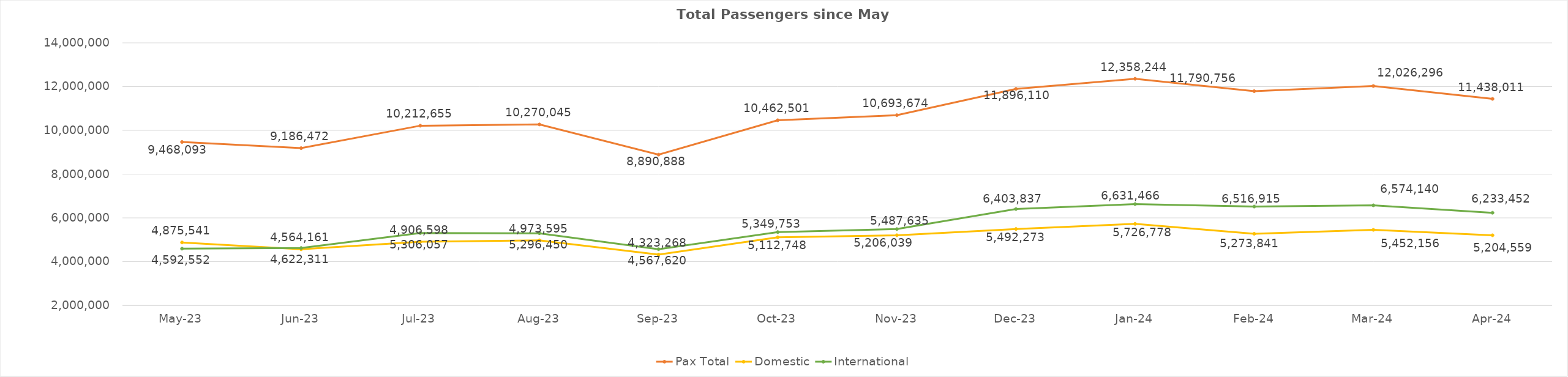
| Category | Pax Total | Domestic | International |
|---|---|---|---|
| 2023-05-01 | 9468093 | 4875541 | 4592552 |
| 2023-06-01 | 9186472 | 4564161 | 4622311 |
| 2023-07-01 | 10212655 | 4906598 | 5306057 |
| 2023-08-01 | 10270045 | 4973595 | 5296450 |
| 2023-09-01 | 8890888 | 4323268 | 4567620 |
| 2023-10-01 | 10462501 | 5112748 | 5349753 |
| 2023-11-01 | 10693674 | 5206039 | 5487635 |
| 2023-12-01 | 11896110 | 5492273 | 6403837 |
| 2024-01-01 | 12358244 | 5726778 | 6631466 |
| 2024-02-01 | 11790756 | 5273841 | 6516915 |
| 2024-03-01 | 12026296 | 5452156 | 6574140 |
| 2024-04-01 | 11438011 | 5204559 | 6233452 |